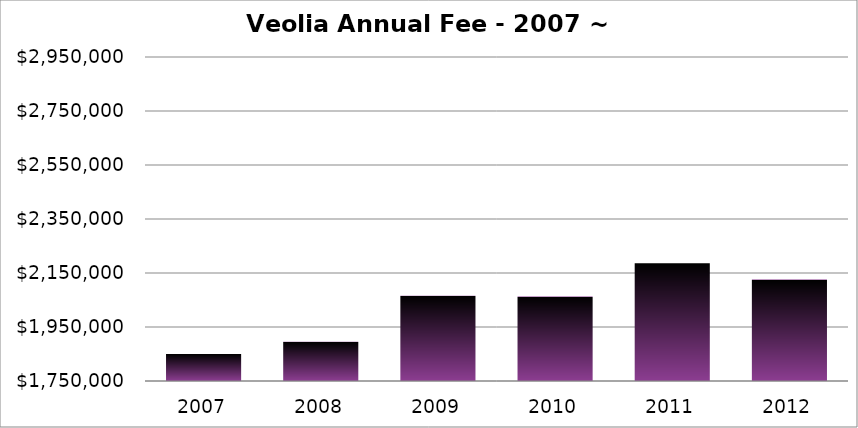
| Category | Base Fee |
|---|---|
| 2007.0 | 1850000 |
| 2008.0 | 1895664 |
| 2009.0 | 2065633 |
| 2010.0 | 2062819.01 |
| 2011.0 | 2185878.61 |
| 2012.0 | 2125598.88 |